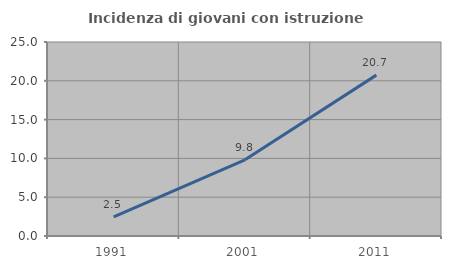
| Category | Incidenza di giovani con istruzione universitaria |
|---|---|
| 1991.0 | 2.459 |
| 2001.0 | 9.816 |
| 2011.0 | 20.732 |